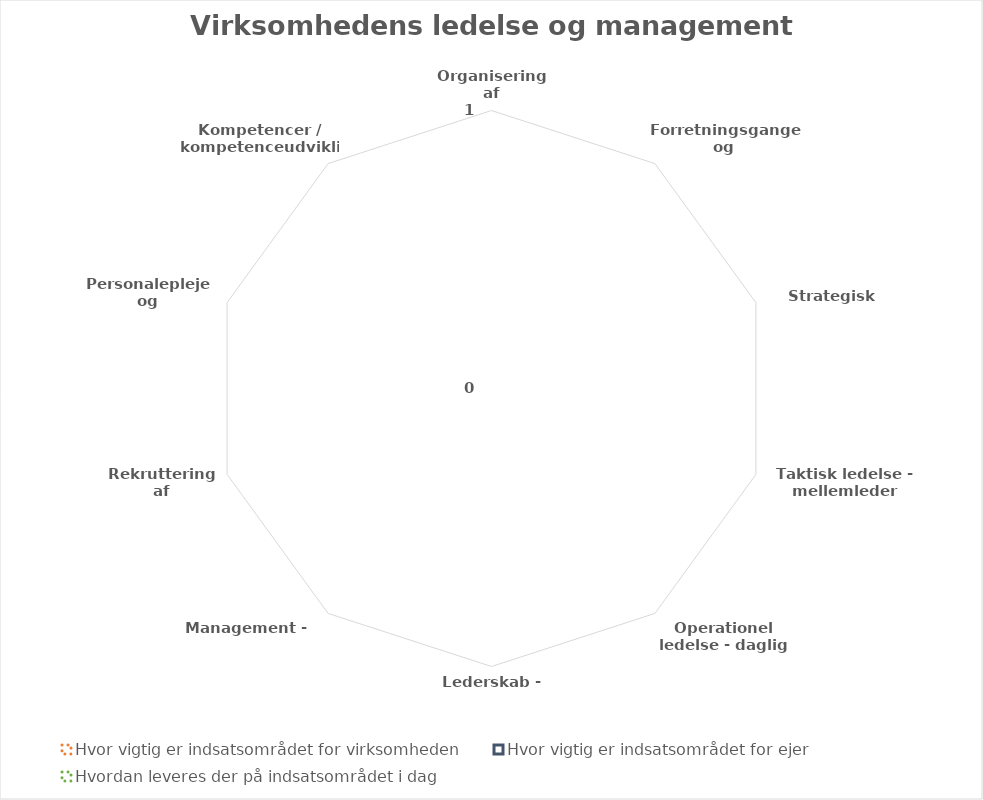
| Category | Hvor vigtig er indsatsområdet for virksomheden | Hvor vigtig er indsatsområdet for ejer | Hvordan leveres der på indsatsområdet i dag |
|---|---|---|---|
| Organisering af virksomheden | 0 | 0 | 0 |
| Forretningsgange og beslutningsprocesser | 0 | 0 | 0 |
| Strategisk ledelse | 0 | 0 | 0 |
| Taktisk ledelse - mellemleder funktion | 0 | 0 | 0 |
| Operationel ledelse - daglig ledelse | 0 | 0 | 0 |
| Lederskab - motivation | 0 | 0 | 0 |
| Management - målstyring | 0 | 0 | 0 |
| Rekruttering af medarbejdere | 0 | 0 | 0 |
| Personalepleje og personaleudvikling | 0 | 0 | 0 |
| Kompetencer / kompetenceudvikling | 0 | 0 | 0 |